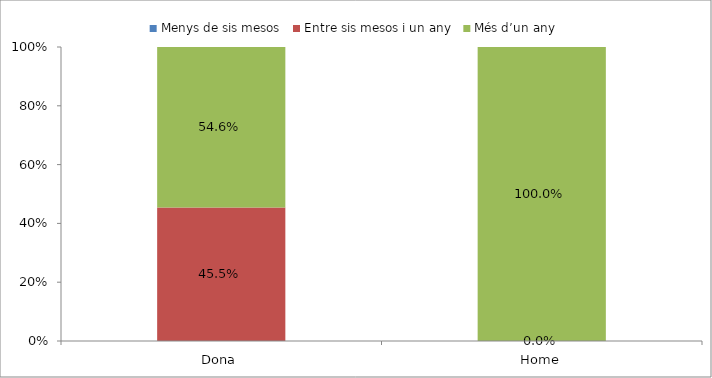
| Category | Menys de sis mesos | Entre sis mesos i un any | Més d’un any |
|---|---|---|---|
| Dona | 0 | 0.454 | 0.546 |
| Home | 0 | 0 | 1 |